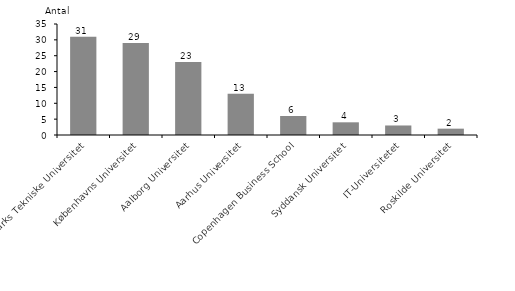
| Category | 2017 |
|---|---|
| Danmarks Tekniske Universitet | 31 |
| Københavns Universitet | 29 |
| Aalborg Universitet | 23 |
| Aarhus Universitet | 13 |
| Copenhagen Business School | 6 |
| Syddansk Universitet | 4 |
| IT-Universitetet | 3 |
| Roskilde Universitet | 2 |